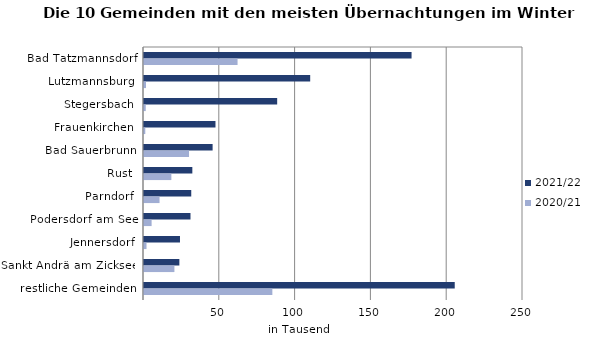
| Category | 2021/22 | 2020/21 |
|---|---|---|
| Bad Tatzmannsdorf | 176490 | 61712 |
| Lutzmannsburg | 109627 | 1310 |
| Stegersbach | 87843 | 1147 |
| Frauenkirchen | 47146 | 851 |
| Bad Sauerbrunn | 45257 | 29702 |
| Rust | 31885 | 18052 |
| Parndorf | 31169 | 10258 |
| Podersdorf am See | 30669 | 5023 |
| Jennersdorf | 23738 | 1656 |
| Sankt Andrä am Zicksee | 23327 | 20064 |
| restliche Gemeinden | 204970 | 84664 |